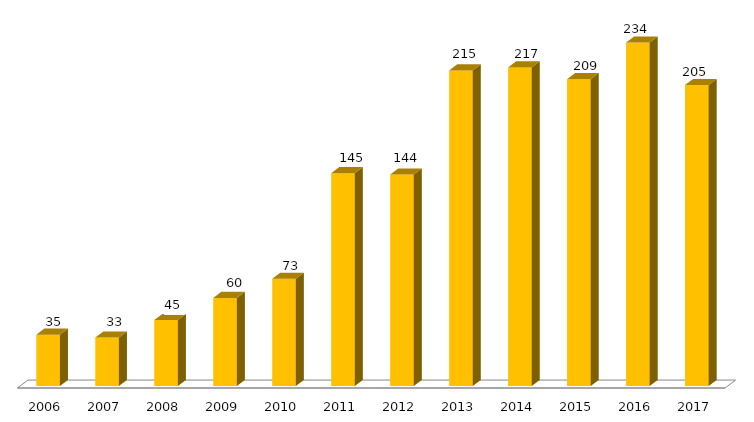
| Category | Mestrado |
|---|---|
| 2006.0 | 35 |
| 2007.0 | 33 |
| 2008.0 | 45 |
| 2009.0 | 60 |
| 2010.0 | 73 |
| 2011.0 | 145 |
| 2012.0 | 144 |
| 2013.0 | 215 |
| 2014.0 | 217 |
| 2015.0 | 209 |
| 2016.0 | 234 |
| 2017.0 | 205 |